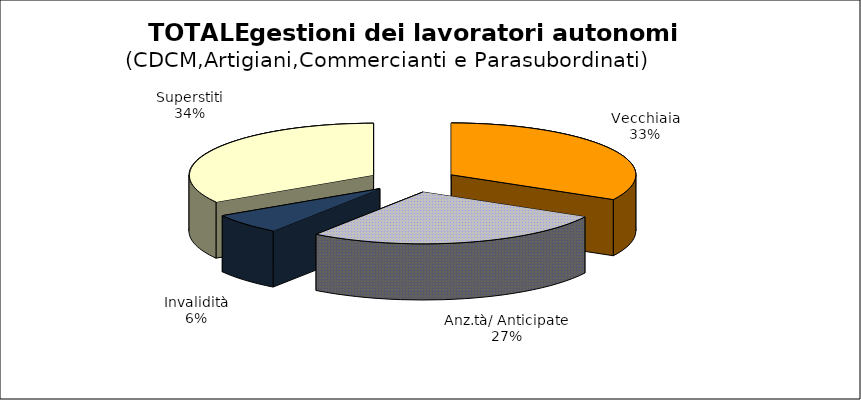
| Category | Series 0 |
|---|---|
| Vecchiaia | 63046 |
| Anz.tà/ Anticipate | 51450 |
| Invalidità | 12379 |
| Superstiti | 64528 |